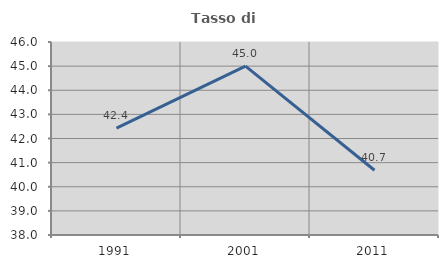
| Category | Tasso di occupazione   |
|---|---|
| 1991.0 | 42.433 |
| 2001.0 | 45 |
| 2011.0 | 40.684 |